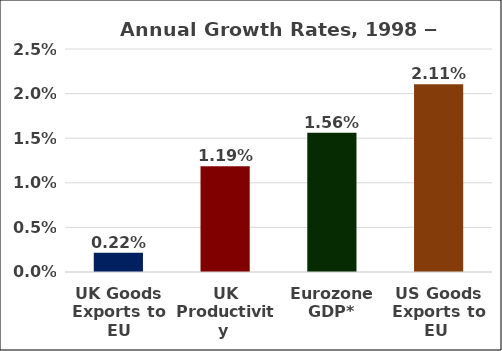
| Category | Series 0 |
|---|---|
| UK Goods Exports to EU | 0.002 |
| UK Productivity  | 0.012 |
| Eurozone GDP* | 0.016 |
| US Goods Exports to EU  | 0.021 |